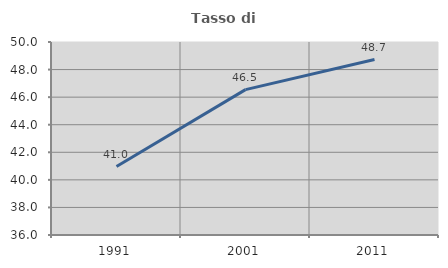
| Category | Tasso di occupazione   |
|---|---|
| 1991.0 | 40.969 |
| 2001.0 | 46.545 |
| 2011.0 | 48.725 |